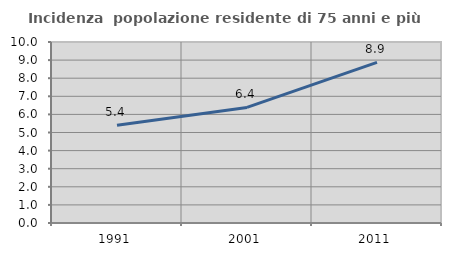
| Category | Incidenza  popolazione residente di 75 anni e più |
|---|---|
| 1991.0 | 5.405 |
| 2001.0 | 6.387 |
| 2011.0 | 8.873 |